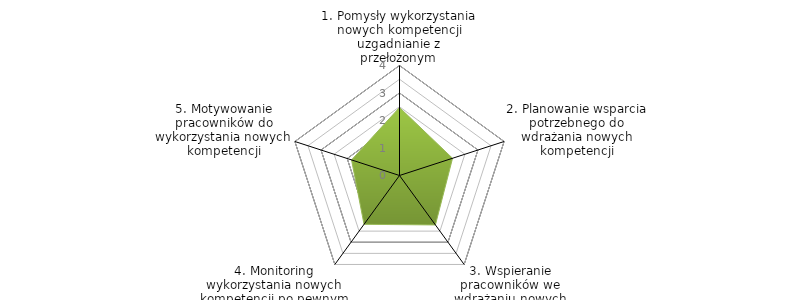
| Category | Series 0 | BENCHMARK |
|---|---|---|
| 1. Pomysły wykorzystania nowych kompetencji uzgadnianie z przełożonym |  | 2.472 |
| 2. Planowanie wsparcia potrzebnego do wdrażania nowych kompetencji |  | 2.028 |
| 3. Wspieranie pracowników we wdrażaniu nowych komeptecji |  | 2.222 |
| 4. Monitoring wykorzystania nowych kompetencji po pewnym okresie |  | 2.194 |
| 5. Motywowanie pracowników do wykorzystania nowych kompetencji |  | 1.833 |